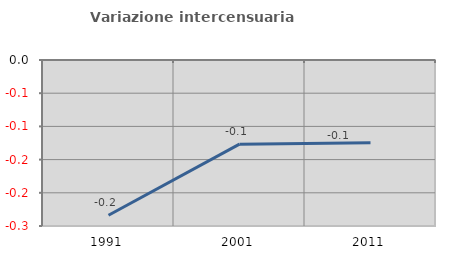
| Category | Variazione intercensuaria annua |
|---|---|
| 1991.0 | -0.234 |
| 2001.0 | -0.127 |
| 2011.0 | -0.124 |